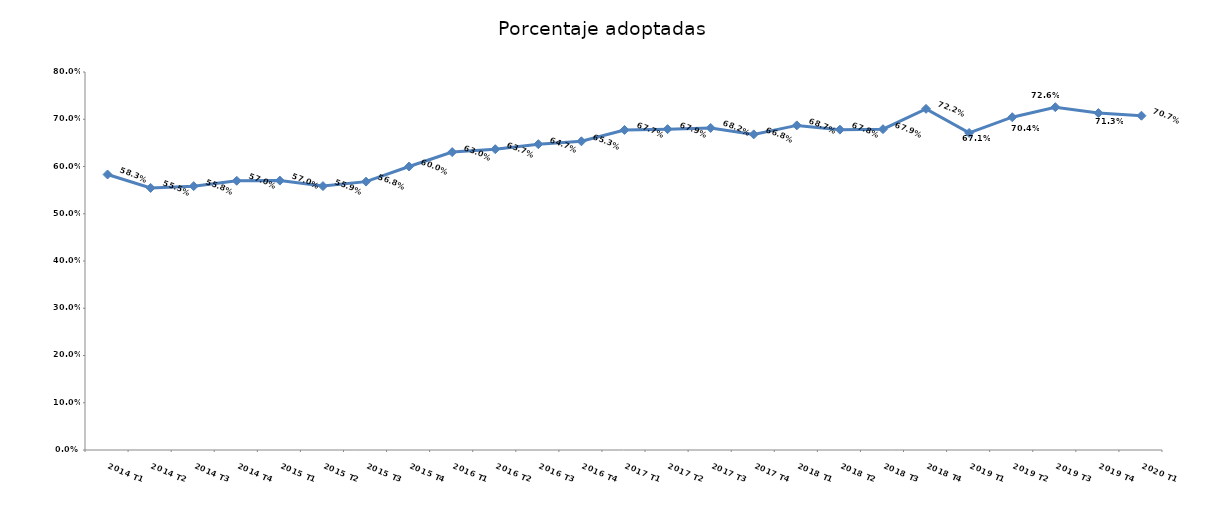
| Category | Series 0 |
|---|---|
| 2014 T1 | 0.583 |
| 2014 T2 | 0.555 |
| 2014 T3 | 0.558 |
| 2014 T4 | 0.57 |
| 2015 T1 | 0.57 |
| 2015 T2 | 0.559 |
| 2015 T3 | 0.568 |
| 2015 T4 | 0.6 |
| 2016 T1 | 0.63 |
| 2016 T2 | 0.637 |
| 2016 T3 | 0.647 |
| 2016 T4 | 0.653 |
| 2017 T1 | 0.677 |
| 2017 T2 | 0.679 |
| 2017 T3 | 0.682 |
| 2017 T4 | 0.668 |
| 2018 T1 | 0.687 |
| 2018 T2 | 0.678 |
| 2018 T3 | 0.679 |
| 2018 T4 | 0.722 |
| 2019 T1 | 0.671 |
| 2019 T2 | 0.704 |
| 2019 T3 | 0.726 |
| 2019 T4 | 0.713 |
| 2020 T1 | 0.707 |